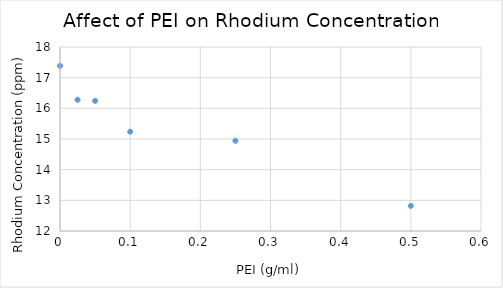
| Category | Series 0 |
|---|---|
| 0.5 | 12.819 |
| 0.25 | 14.942 |
| 0.1 | 15.24 |
| 0.05 | 16.245 |
| 0.025 | 16.28 |
| 0.0 | 17.385 |